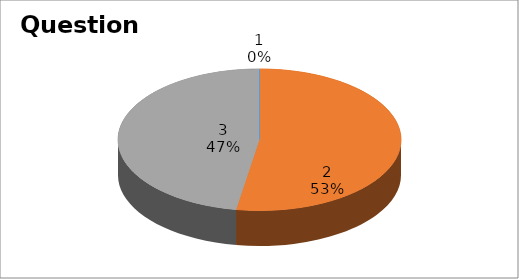
| Category | Series 0 |
|---|---|
| 0 | 0 |
| 1 | 10 |
| 2 | 9 |